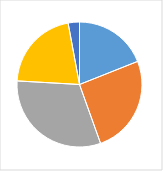
| Category | Series 0 |
|---|---|
| 0 | 0.188 |
| 1 | 0.254 |
| 2 | 0.312 |
| 3 | 0.21 |
| 4 | 0.029 |